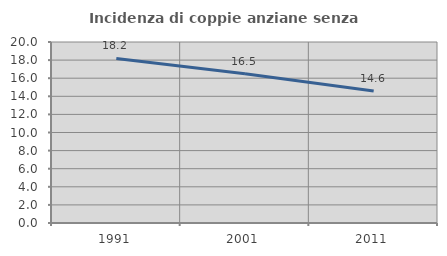
| Category | Incidenza di coppie anziane senza figli  |
|---|---|
| 1991.0 | 18.182 |
| 2001.0 | 16.495 |
| 2011.0 | 14.583 |